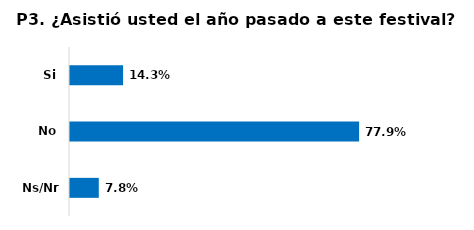
| Category | Series 0 |
|---|---|
| Si | 0.143 |
| No | 0.779 |
| Ns/Nr | 0.078 |